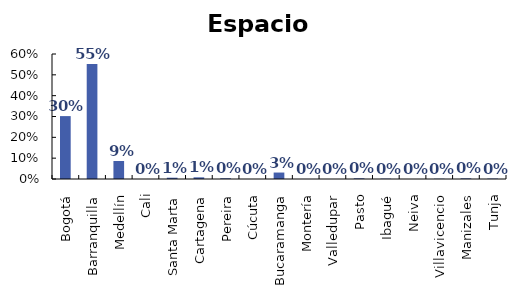
| Category | Espacio Público |
|---|---|
| Bogotá | 0.302 |
| Barranquilla | 0.552 |
| Medellín | 0.086 |
| Cali | 0 |
| Santa Marta | 0.006 |
| Cartagena | 0.008 |
| Pereira | 0.003 |
| Cúcuta | 0 |
| Bucaramanga | 0.031 |
| Montería | 0 |
| Valledupar | 0 |
| Pasto | 0.003 |
| Ibagué | 0.002 |
| Neiva | 0 |
| Villavicencio | 0.001 |
| Manizales | 0.003 |
| Tunja | 0.002 |